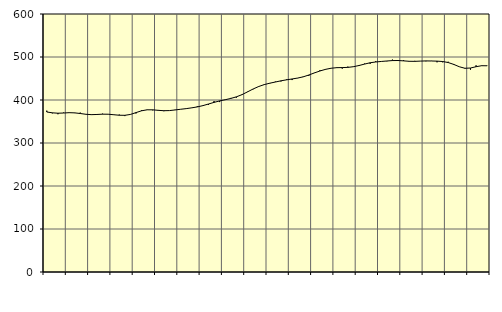
| Category | Piggar | Series 1 |
|---|---|---|
| nan | 375.2 | 372.1 |
| 1.0 | 369 | 370.19 |
| 1.0 | 366.9 | 369.26 |
| 1.0 | 370.7 | 369.73 |
| nan | 370.7 | 370.53 |
| 2.0 | 369.6 | 370.08 |
| 2.0 | 370.7 | 368.57 |
| 2.0 | 366.3 | 366.8 |
| nan | 365.2 | 365.92 |
| 3.0 | 366 | 366.35 |
| 3.0 | 368.2 | 367.04 |
| 3.0 | 367 | 366.92 |
| nan | 365.2 | 365.75 |
| 4.0 | 366.1 | 364.55 |
| 4.0 | 362.6 | 364.4 |
| 4.0 | 366.7 | 366.4 |
| nan | 368.7 | 370.68 |
| 5.0 | 376.3 | 374.91 |
| 5.0 | 376.8 | 377.21 |
| 5.0 | 376 | 377.16 |
| nan | 376.8 | 375.98 |
| 6.0 | 374 | 375.1 |
| 6.0 | 375.2 | 375.39 |
| 6.0 | 377.2 | 376.83 |
| nan | 378.3 | 378.43 |
| 7.0 | 380 | 379.92 |
| 7.0 | 381.5 | 381.76 |
| 7.0 | 385.5 | 383.94 |
| nan | 387.5 | 386.9 |
| 8.0 | 388.7 | 390.66 |
| 8.0 | 397.6 | 394.47 |
| 8.0 | 395.2 | 397.84 |
| nan | 401.1 | 400.61 |
| 9.0 | 404.8 | 403.63 |
| 9.0 | 405.4 | 407.33 |
| 9.0 | 413 | 412.36 |
| nan | 419.4 | 418.83 |
| 10.0 | 425 | 425.55 |
| 10.0 | 432 | 431.32 |
| 10.0 | 436.7 | 435.79 |
| nan | 438.4 | 439.07 |
| 11.0 | 442.8 | 441.8 |
| 11.0 | 443.2 | 444.6 |
| 11.0 | 448 | 446.9 |
| nan | 446.4 | 448.88 |
| 12.0 | 450.7 | 451.03 |
| 12.0 | 454.6 | 453.88 |
| 12.0 | 456.2 | 458.16 |
| nan | 463.4 | 462.97 |
| 13.0 | 469.2 | 467.5 |
| 13.0 | 470.5 | 471.28 |
| 13.0 | 474.1 | 473.87 |
| nan | 476 | 475.18 |
| 14.0 | 472.9 | 475.43 |
| 14.0 | 477.7 | 475.8 |
| 14.0 | 477 | 477.45 |
| nan | 479.3 | 480.17 |
| 15.0 | 484.7 | 483.53 |
| 15.0 | 484.1 | 486.6 |
| 15.0 | 490.2 | 488.44 |
| nan | 489.5 | 489.63 |
| 16.0 | 490.1 | 490.73 |
| 16.0 | 494 | 491.68 |
| 16.0 | 492.9 | 491.84 |
| nan | 492.7 | 491.02 |
| 17.0 | 489.4 | 490.04 |
| 17.0 | 491 | 489.87 |
| 17.0 | 490.5 | 490.45 |
| nan | 490.1 | 490.91 |
| 18.0 | 491 | 490.73 |
| 18.0 | 487.7 | 490.34 |
| 18.0 | 487.7 | 489.5 |
| nan | 488.9 | 487.13 |
| 19.0 | 481.6 | 482.75 |
| 19.0 | 477.1 | 477.31 |
| 19.0 | 473.1 | 473.8 |
| nan | 470.5 | 474.35 |
| 20.0 | 480.6 | 477.4 |
| 20.0 | 480.3 | 479.74 |
| 20.0 | 480 | 479.61 |